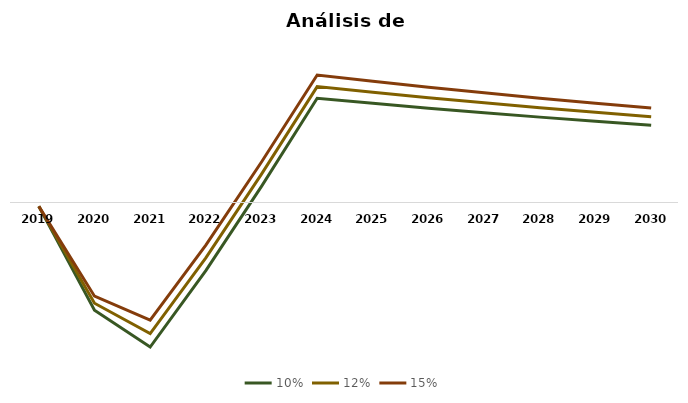
| Category | 10% | 12% | 15% |
|---|---|---|---|
| 2019.0 | -236324212.25 | -236324212.25 | -236324212.25 |
| 2020.0 | -6635061903.167 | -6199592647.154 | -5764123391.141 |
| 2021.0 | -8894365364.199 | -8065911015.766 | -7237456667.334 |
| 2022.0 | -4196917911.242 | -3408875359.488 | -2620832807.734 |
| 2023.0 | 993212845.633 | 1742814878.08 | 2492416910.527 |
| 2024.0 | 6417329688.836 | 7130366320.929 | 7843402953.021 |
| 2025.0 | 6104293945.71 | 6782548828.567 | 7460803711.423 |
| 2026.0 | 5806528008.13 | 6451697786.812 | 7096867565.493 |
| 2027.0 | 5523287018.788 | 6136985576.431 | 6750684134.074 |
| 2028.0 | 5253862454.326 | 5837624949.251 | 6421387444.176 |
| 2029.0 | 4997580352.982 | 5552867058.869 | 6108153764.756 |
| 2030.0 | 4753799628.68 | 5281999587.423 | 5810199546.165 |